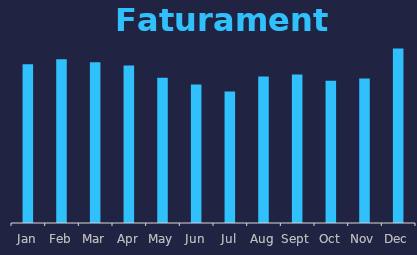
| Category | Series 0 |
|---|---|
| 1900-01-01 | 664750 |
| 1900-02-01 | 686093 |
| 1900-03-01 | 672890 |
| 1900-04-01 | 659517 |
| 1900-05-01 | 607943 |
| 1900-06-01 | 579955 |
| 1900-07-01 | 551198 |
| 1900-08-01 | 613191 |
| 1900-09-01 | 621795 |
| 1900-10-01 | 595487 |
| 1900-11-01 | 605055 |
| 1900-12-01 | 730777 |